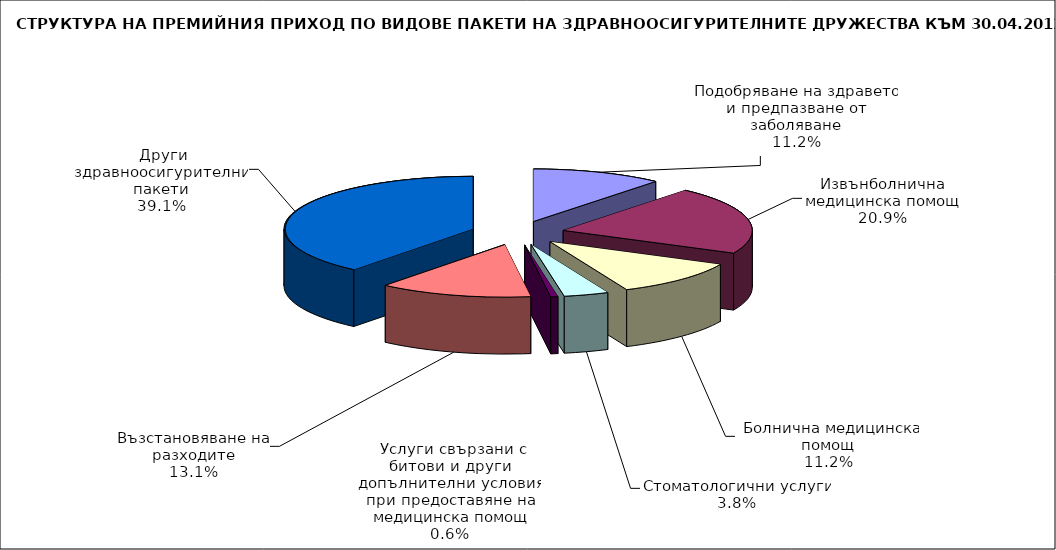
| Category | Series 0 |
|---|---|
| 1. Подобряване на здравето и предпазване от заболяване | 2361346.987 |
| 2. Извънболнична медицинска помощ | 4420117.924 |
| 3. Болнична медицинска помощ | 2367679.446 |
| 4. Стоматологични услуги | 809871.654 |
| 5. Услуги свързани с битови и други допълнителни условия при предоставяне на медицинска помощ | 128858.95 |
| 6. Възстановяване на разходите | 2759694.951 |
| 7. Други здравноосигурителни пакети | 8257441.315 |